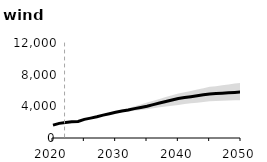
| Category | Ref |
|---|---|
| 2020.0 | 1624.589 |
| 2021.0 | 1845.632 |
| 2022.0 | 1966.655 |
| 2023.0 | 2040.185 |
| 2024.0 | 2097.573 |
| 2025.0 | 2356.6 |
| 2026.0 | 2514.042 |
| 2027.0 | 2689.688 |
| 2028.0 | 2888.454 |
| 2029.0 | 3071.208 |
| 2030.0 | 3249.283 |
| 2031.0 | 3410.088 |
| 2032.0 | 3547.828 |
| 2033.0 | 3712.741 |
| 2034.0 | 3861.396 |
| 2035.0 | 4012.048 |
| 2036.0 | 4216.604 |
| 2037.0 | 4410.874 |
| 2038.0 | 4602.86 |
| 2039.0 | 4803.085 |
| 2040.0 | 4995.07 |
| 2041.0 | 5109.64 |
| 2042.0 | 5219.469 |
| 2043.0 | 5334.031 |
| 2044.0 | 5452.317 |
| 2045.0 | 5568.662 |
| 2046.0 | 5610.058 |
| 2047.0 | 5661.964 |
| 2048.0 | 5713.334 |
| 2049.0 | 5756.704 |
| 2050.0 | 5805.199 |